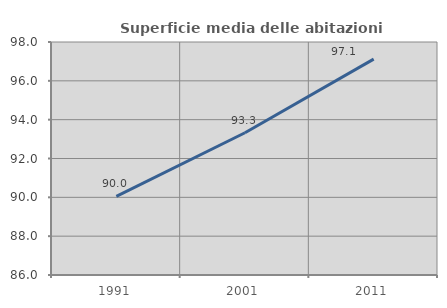
| Category | Superficie media delle abitazioni occupate |
|---|---|
| 1991.0 | 90.048 |
| 2001.0 | 93.328 |
| 2011.0 | 97.117 |